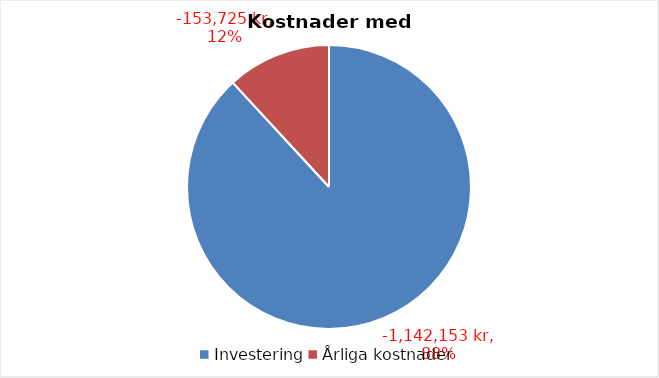
| Category | Series 1 | Series 0 |
|---|---|---|
| Investering | -1142152.565 | -1192152.565 |
| Årliga kostnader | -153724.51 | -153724.51 |